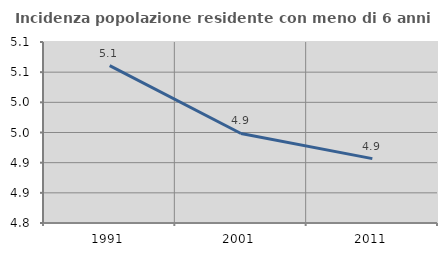
| Category | Incidenza popolazione residente con meno di 6 anni |
|---|---|
| 1991.0 | 5.061 |
| 2001.0 | 4.948 |
| 2011.0 | 4.907 |